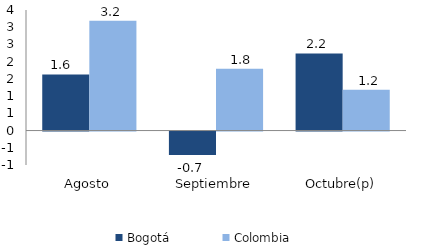
| Category | Bogotá | Colombia |
|---|---|---|
| Agosto | 1.63 | 3.187 |
| Septiembre | -0.683 | 1.797 |
| Octubre(p) | 2.237 | 1.182 |